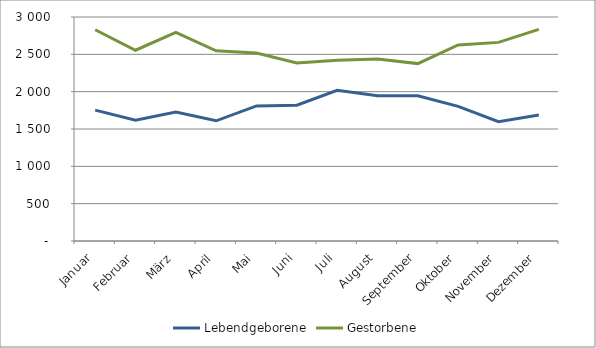
| Category | Lebendgeborene | Gestorbene |
|---|---|---|
| Januar | 1753 | 2829 |
| Februar | 1619 | 2555 |
| März | 1727 | 2793 |
| April | 1610 | 2548 |
| Mai | 1809 | 2518 |
| Juni | 1818 | 2384 |
| Juli | 2018 | 2422 |
| August | 1944 | 2436 |
| September | 1946 | 2376 |
| Oktober | 1803 | 2625 |
| November | 1597 | 2660 |
| Dezember | 1687 | 2835 |